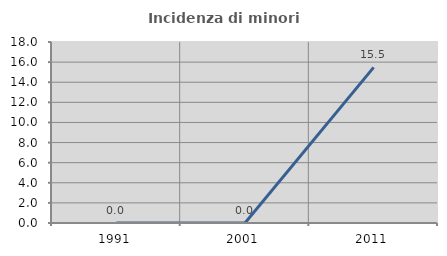
| Category | Incidenza di minori stranieri |
|---|---|
| 1991.0 | 0 |
| 2001.0 | 0 |
| 2011.0 | 15.476 |